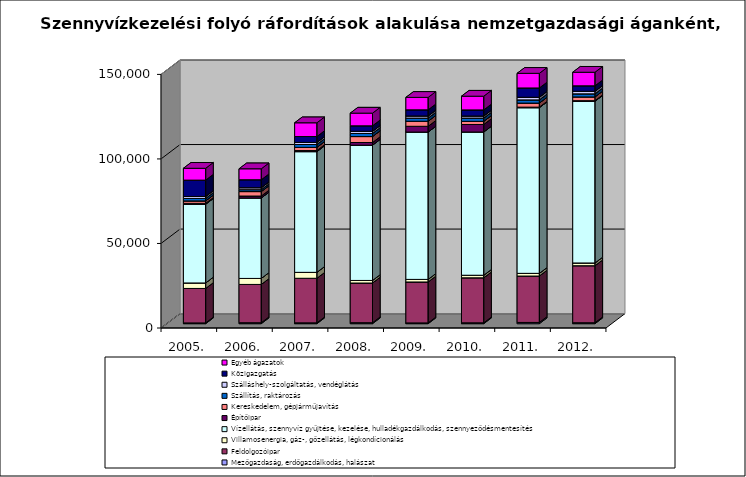
| Category | Mezőgazdaság, erdőgazdálkodás, halászat | Feldolgozóipar | Villamosenergia, gáz-, gőzellátás, légkondícionálás | Vízellátás, szennyvíz gyűjtése, kezelése, hulladékgazdálkodás, szennyeződésmentesítés | Építőipar | Kereskedelem, gépjárműjavítás | Szállítás, raktározás | Szálláshely-szolgáltatás, vendéglátás | Közigazgatás | Egyéb ágazatok |
|---|---|---|---|---|---|---|---|---|---|---|
| 2005. | 448.616 | 20393.219 | 3255.551 | 46556.945 | 517.048 | 1433.038 | 1469.175 | 1165.493 | 9672.052 | 7000.977 |
| 2006. | 552.554 | 22662.157 | 3550.162 | 47582.17 | 1149.035 | 2643.776 | 1128.831 | 1151.465 | 4719.713 | 6471.609 |
| 2007. | 484.386 | 26376.594 | 3501.866 | 71411.515 | 620.391 | 1883.615 | 1710.81 | 1208.313 | 3502.9 | 8124.737 |
| 2008. | 572.402 | 23482.899 | 1516.746 | 79998.109 | 1588.013 | 3519.298 | 1824.996 | 1286.568 | 3247.156 | 7492.239 |
| 2009. | 458.329 | 24213.085 | 1525.396 | 87141.426 | 3401.701 | 2994.208 | 1861.552 | 1253.737 | 3649.818 | 7348.058 |
| 2010. | 497.164 | 26640.143 | 1512.792 | 84726.376 | 4434.231 | 1872.915 | 1931.174 | 1206.982 | 3619.704 | 8108.339 |
| 2011. | 739.42 | 27440.128 | 1586.461 | 98002.443 | 314.804 | 2387.318 | 1889.357 | 1566.523 | 5494.682 | 8649.186 |
| 2012. | 545.845 | 33730.018 | 1640.471 | 95659.205 | 321.234 | 2221.706 | 1831.232 | 1518.331 | 3224.921 | 8017.679 |